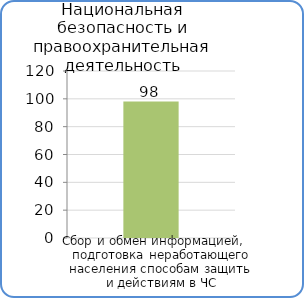
| Category | Расходы |
|---|---|
| Подготовка населения к действиям при ЧС | 98000 |